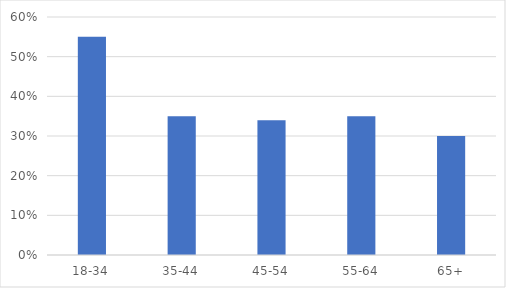
| Category | Strongly agree |
|---|---|
| 18-34 | 0.55 |
| 35-44 | 0.35 |
| 45-54 | 0.34 |
| 55-64 | 0.35 |
| 65+ | 0.3 |